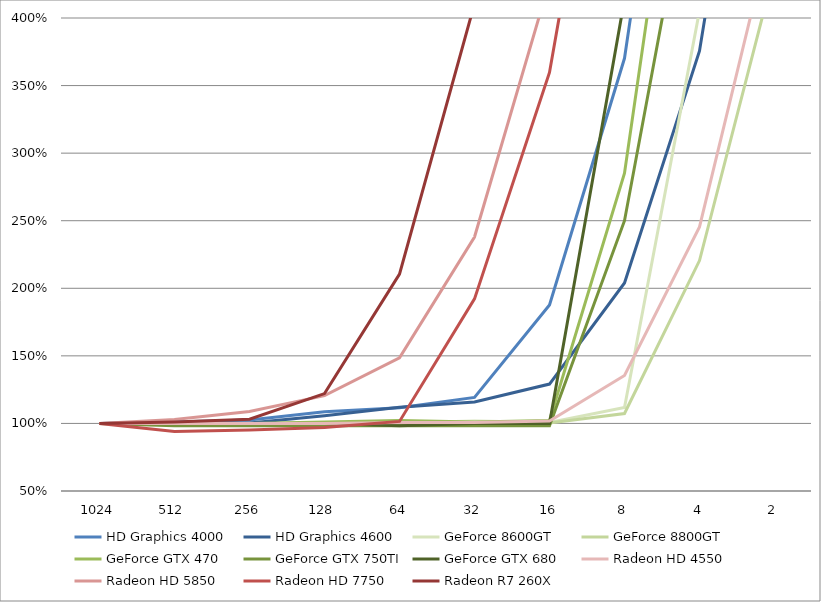
| Category | HD Graphics 4000 | HD Graphics 4600 | GeForce 8600GT | GeForce 8800GT | GeForce GTX 470 | GeForce GTX 750TI | GeForce GTX 680 | Radeon HD 4550 | Radeon HD 5850 | Radeon HD 7750 | Radeon R7 260X |
|---|---|---|---|---|---|---|---|---|---|---|---|
| 1024.0 | 1 | 1 | 1 | 1 | 1 | 1 | 1 | 1 | 1 | 1 | 1 |
| 512.0 | 1.011 | 1.003 | 1.003 | 1 | 1 | 0.984 | 1 | 1 | 1.028 | 0.94 | 1.011 |
| 256.0 | 1.025 | 1.003 | 1 | 1 | 1 | 0.984 | 1 | 1 | 1.089 | 0.951 | 1.032 |
| 128.0 | 1.087 | 1.057 | 0.997 | 1 | 1.011 | 0.984 | 1 | 1 | 1.206 | 0.97 | 1.221 |
| 64.0 | 1.116 | 1.12 | 1.003 | 1 | 1.021 | 0.984 | 0.983 | 1.006 | 1.486 | 1.015 | 2.105 |
| 32.0 | 1.193 | 1.159 | 1.018 | 1 | 1.011 | 0.984 | 1 | 1.008 | 2.379 | 1.922 | 4.105 |
| 16.0 | 1.876 | 1.291 | 1.008 | 1.003 | 1.021 | 0.984 | 1 | 1.017 | 4.27 | 3.597 | 9.032 |
| 8.0 | 3.702 | 2.039 | 1.118 | 1.073 | 2.851 | 2.5 | 4.138 | 1.354 | 8.092 | 6.757 | 18.063 |
| 4.0 | 7.462 | 3.757 | 4.054 | 2.205 | 6.691 | 5.475 | 10.431 | 2.454 | 15.826 | 13.291 | 33.632 |
| 2.0 | 14.975 | 7.165 | 8.977 | 4.355 | 14.915 | 11.885 | 23.672 | 4.74 | 31 | 26.549 | 70.663 |